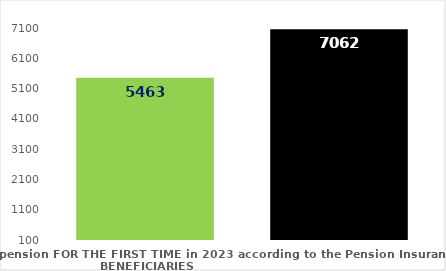
| Category | broj korisnika |
|---|---|
| Pension beneficiaries entitled to pension FOR THE FIRST TIME in 2023 according to the Pension Insurance Act  - NEW BENEFICIARIES | 5463 |
| Pension beneficiaries whose pension entitlement ceased in 2023  -  death caused,   
and who were retired according to the Pension Insurance Act   | 7062 |